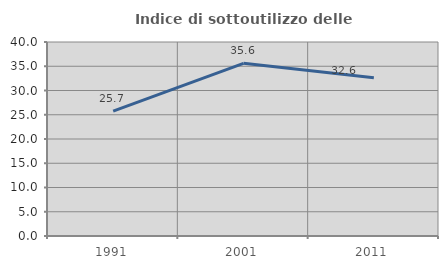
| Category | Indice di sottoutilizzo delle abitazioni  |
|---|---|
| 1991.0 | 25.738 |
| 2001.0 | 35.61 |
| 2011.0 | 32.62 |